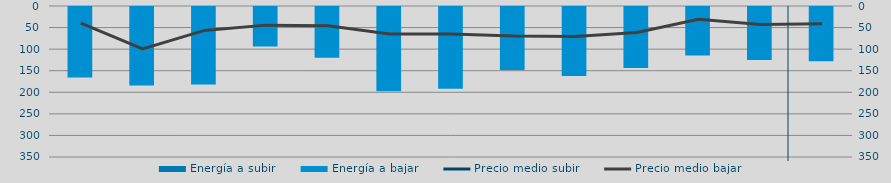
| Category | Energía a subir | Energía a bajar |
|---|---|---|
| E |  | 165.84 |
| F |  | 184.155 |
| M |  | 182.05 |
| A |  | 93.896 |
| M |  | 120.063 |
| J |  | 197.687 |
| J |  | 191.747 |
| A |  | 148.51 |
| S |  | 162.496 |
| O |  | 143.824 |
| N |  | 114.874 |
| D |  | 125.279 |
| E |  | 128.191 |